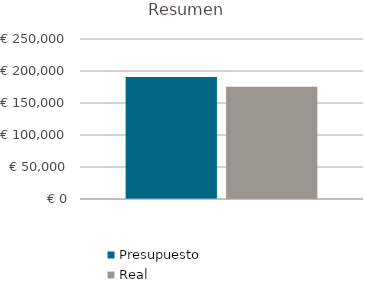
| Category | Presupuesto | Real |
|---|---|---|
| 0 | 190523.69 | 175523.5 |